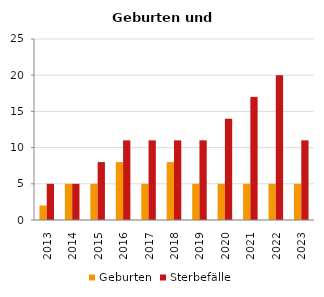
| Category | Geburten | Sterbefälle |
|---|---|---|
| 2013.0 | 2 | 5 |
| 2014.0 | 5 | 5 |
| 2015.0 | 5 | 8 |
| 2016.0 | 8 | 11 |
| 2017.0 | 5 | 11 |
| 2018.0 | 8 | 11 |
| 2019.0 | 5 | 11 |
| 2020.0 | 5 | 14 |
| 2021.0 | 5 | 17 |
| 2022.0 | 5 | 20 |
| 2023.0 | 5 | 11 |